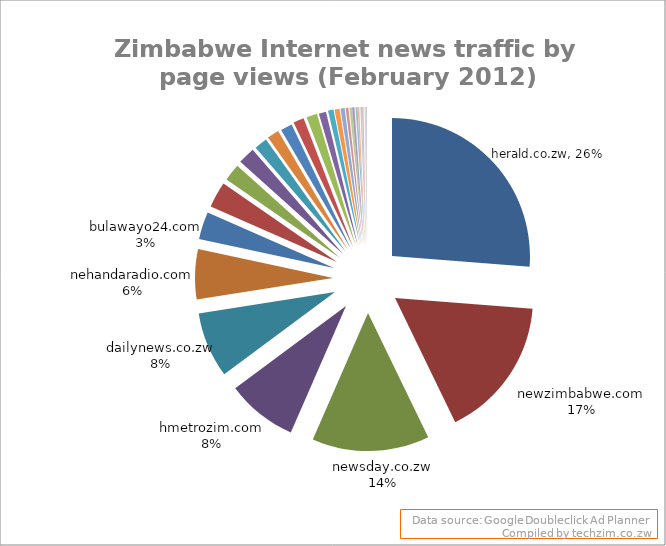
| Category | Page views | Unique visitors (estimated cookies) |
|---|---|---|
| herald.co.zw | 13000000 | 680000 |
| newzimbabwe.com | 8200000 | 740000 |
| newsday.co.zw | 6800000 | 510000 |
| hmetrozim.com | 4100000 | 290000 |
| dailynews.co.zw | 3800000 | 390000 |
| nehandaradio.com | 2900000 | 290000 |
| bulawayo24.com | 1600000 | 160000 |
| newsdzezimbabwe.co.uk | 1500000 | 77000 |
| zimeye.org | 1000000 | 180000 |
| sundaymail.co.zw | 990000 | 140000 |
| chronicle.co.zw | 750000 | 75000 |
| theindependent.co.zw | 690000 | 140000 |
| thezimbabwean.co.uk | 680000 | 150000 |
| thestandard.co.zw | 620000 | 140000 |
| thezimbabwemail.com | 620000 | 80000 |
| financialgazette.co.zw | 420000 | 92000 |
| kwayedza.co.zw | 320000 | 35000 |
| swradioafrica.com | 290000 | 69000 |
| newsdzezimbabwe.wordpress.com | 240000 | 78000 |
| zimdaily.com | 160000 | 57000 |
| zimbojam.com | 150000 | 58000 |
| zbc.co.zw | 140000 | 33000 |
| sundaynews.co.zw | 120000 | 27000 |
| techzim.co.zw | 100000 | 43000 |
| radiovop.com | 93000 | 32000 |
| zimonline.co.za | 93000 | 32000 |
| izimbabwe.co.zw | 93000 | 32000 |
| 3-mob.com | 47000 | 27000 |